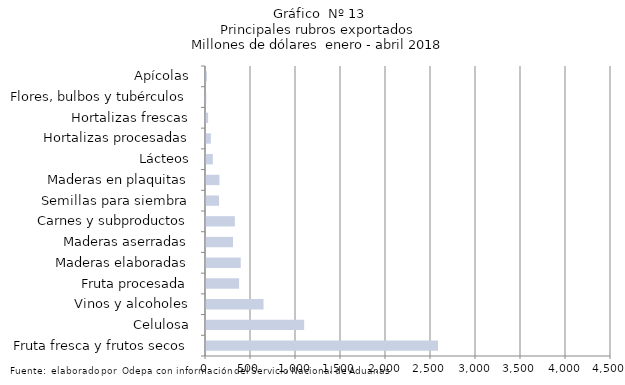
| Category | Series 7 |
|---|---|
| Fruta fresca y frutos secos | 2577894.668 |
| Celulosa | 1090621.134 |
| Vinos y alcoholes | 639240.529 |
| Fruta procesada | 367763.225 |
| Maderas elaboradas | 386081.273 |
| Maderas aserradas | 299737.614 |
| Carnes y subproductos | 321036.537 |
| Semillas para siembra | 145057.18 |
| Maderas en plaquitas | 149137.273 |
| Lácteos | 76131.858 |
| Hortalizas procesadas | 53981.048 |
| Hortalizas frescas | 23272.481 |
| Flores, bulbos y tubérculos | 3268.463 |
| Apícolas | 9357.704 |